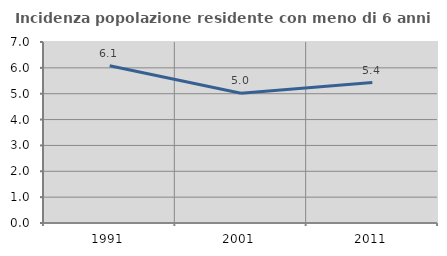
| Category | Incidenza popolazione residente con meno di 6 anni |
|---|---|
| 1991.0 | 6.081 |
| 2001.0 | 5.017 |
| 2011.0 | 5.429 |